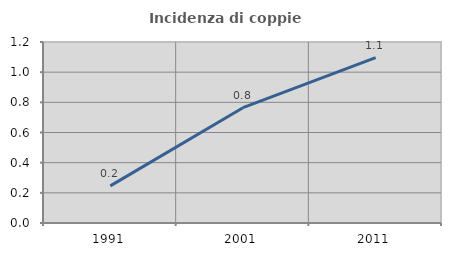
| Category | Incidenza di coppie miste |
|---|---|
| 1991.0 | 0.246 |
| 2001.0 | 0.765 |
| 2011.0 | 1.097 |